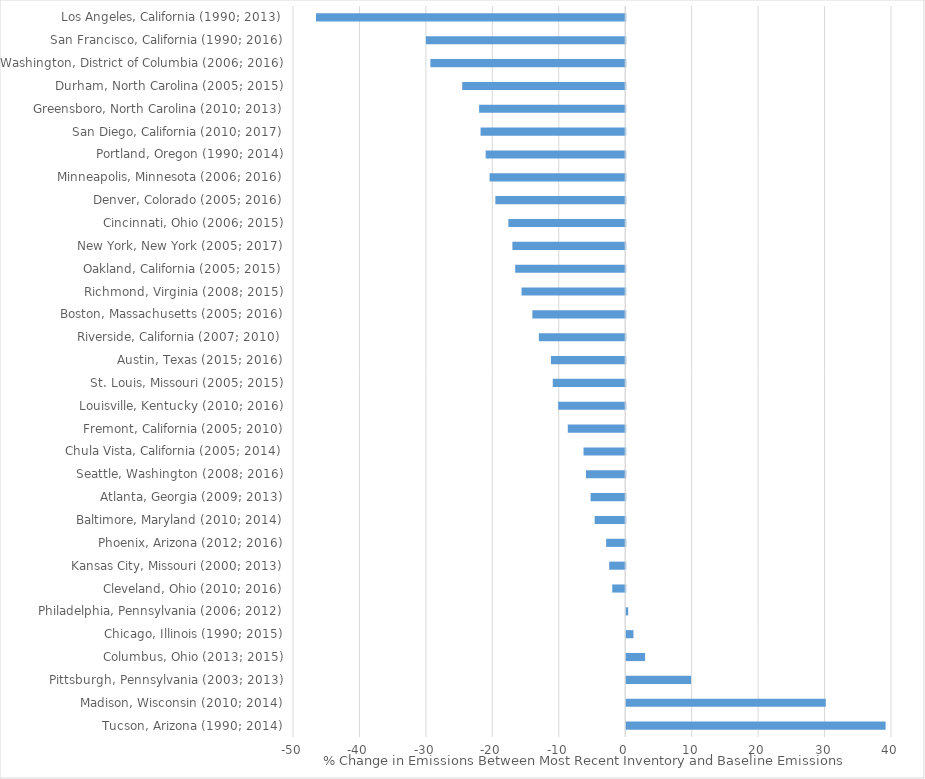
| Category | Series 0 |
|---|---|
| Tucson, Arizona (1990; 2014) | 39.035 |
| Madison, Wisconsin (2010; 2014) | 30.034 |
| Pittsburgh, Pennsylvania (2003; 2013) | 9.76 |
| Columbus, Ohio (2013; 2015) | 2.839 |
| Chicago, Illinois (1990; 2015) | 1.088 |
| Philadelphia, Pennsylvania (2006; 2012) | 0.298 |
| Cleveland, Ohio (2010; 2016) | -1.954 |
| Kansas City, Missouri (2000; 2013) | -2.408 |
| Phoenix, Arizona (2012; 2016) | -2.875 |
| Baltimore, Maryland (2010; 2014) | -4.595 |
| Atlanta, Georgia (2009; 2013) | -5.209 |
| Seattle, Washington (2008; 2016) | -5.914 |
| Chula Vista, California (2005; 2014) | -6.273 |
| Fremont, California (2005; 2010) | -8.645 |
| Louisville, Kentucky (2010; 2016) | -10.1 |
| St. Louis, Missouri (2005; 2015) | -10.907 |
| Austin, Texas (2015; 2016) | -11.184 |
| Riverside, California (2007; 2010) | -13 |
| Boston, Massachusetts (2005; 2016) | -13.978 |
| Richmond, Virginia (2008; 2015) | -15.603 |
| Oakland, California (2005; 2015) | -16.562 |
| New York, New York (2005; 2017) | -16.982 |
| Cincinnati, Ohio (2006; 2015) | -17.588 |
| Denver, Colorado (2005; 2016) | -19.544 |
| Minneapolis, Minnesota (2006; 2016) | -20.412 |
| Portland, Oregon (1990; 2014) | -21 |
| San Diego, California (2010; 2017) | -21.771 |
| Greensboro, North Carolina (2010; 2013) | -21.989 |
| Durham, North Carolina (2005; 2015) | -24.532 |
| Washington, District of Columbia (2006; 2016) | -29.323 |
| San Francisco, California (1990; 2016) | -30 |
| Los Angeles, California (1990; 2013) | -46.538 |